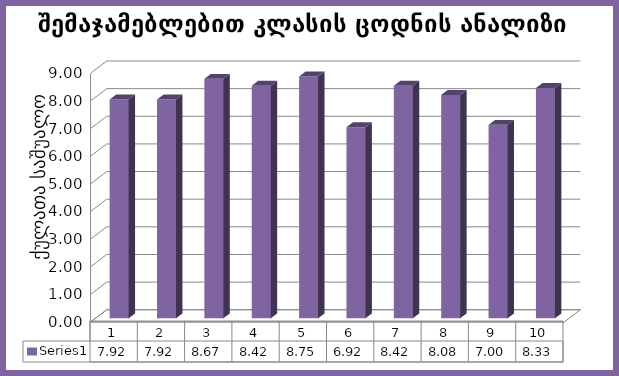
| Category | Series 0 |
|---|---|
| 0 | 7.917 |
| 1 | 7.917 |
| 2 | 8.667 |
| 3 | 8.417 |
| 4 | 8.75 |
| 5 | 6.917 |
| 6 | 8.417 |
| 7 | 8.083 |
| 8 | 7 |
| 9 | 8.333 |